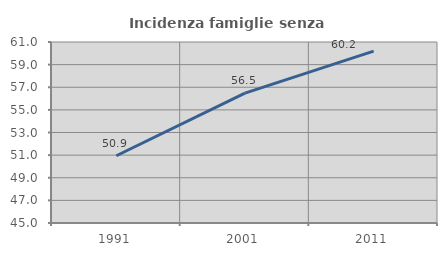
| Category | Incidenza famiglie senza nuclei |
|---|---|
| 1991.0 | 50.943 |
| 2001.0 | 56.481 |
| 2011.0 | 60.194 |